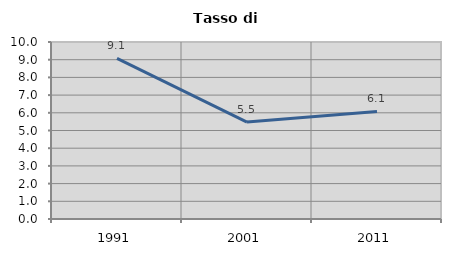
| Category | Tasso di disoccupazione   |
|---|---|
| 1991.0 | 9.077 |
| 2001.0 | 5.477 |
| 2011.0 | 6.074 |